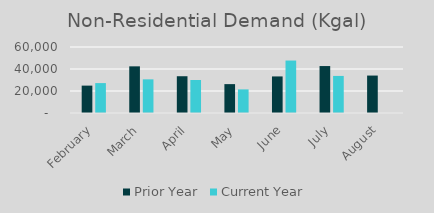
| Category | Prior Year | Current Year |
|---|---|---|
| February | 24891.705 | 27184.287 |
| March | 42416.796 | 30591.784 |
| April | 33427.881 | 30008.586 |
| May | 26254.448 | 21459.484 |
| June | 33248.873 | 47687.401 |
| July | 42679.938 | 33702.696 |
| August | 34036.498 | 0 |